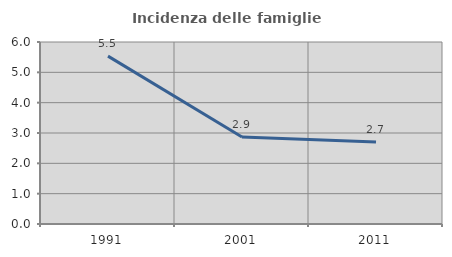
| Category | Incidenza delle famiglie numerose |
|---|---|
| 1991.0 | 5.534 |
| 2001.0 | 2.87 |
| 2011.0 | 2.705 |